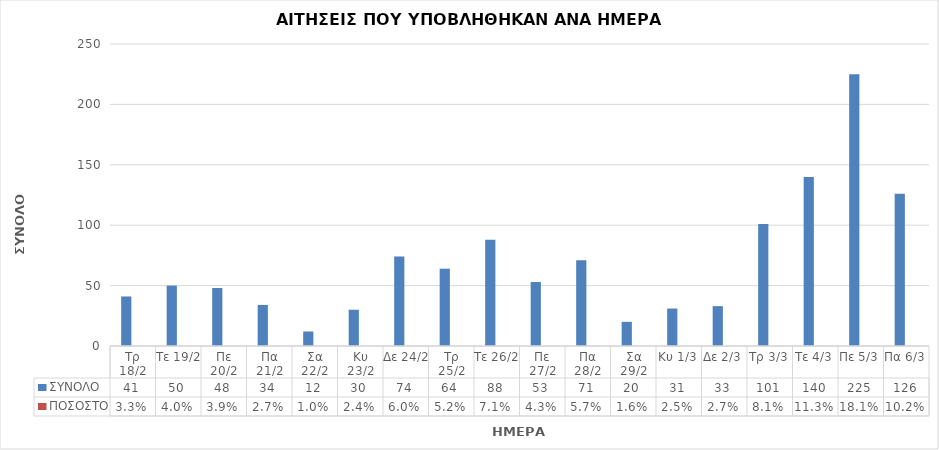
| Category | ΣΥΝΟΛΟ | ΠΟΣΟΣΤΟ |
|---|---|---|
| Τρ 18/2 | 41 | 0.033 |
| Τε 19/2 | 50 | 0.04 |
| Πε 20/2 | 48 | 0.039 |
| Πα 21/2 | 34 | 0.027 |
| Σα 22/2 | 12 | 0.01 |
| Κυ 23/2 | 30 | 0.024 |
| Δε 24/2 | 74 | 0.06 |
| Τρ 25/2 | 64 | 0.052 |
| Τε 26/2 | 88 | 0.071 |
| Πε 27/2 | 53 | 0.043 |
| Πα 28/2 | 71 | 0.057 |
| Σα 29/2 | 20 | 0.016 |
| Κυ 1/3 | 31 | 0.025 |
| Δε 2/3 | 33 | 0.027 |
| Τρ 3/3 | 101 | 0.081 |
| Τε 4/3 | 140 | 0.113 |
| Πε 5/3 | 225 | 0.181 |
| Πα 6/3 | 126 | 0.102 |